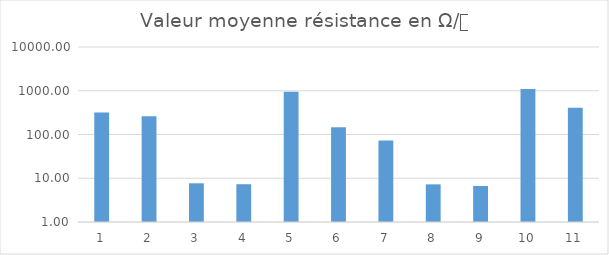
| Category | Series 0 |
|---|---|
| 1.0 | 319.55 |
| 2.0 | 260.09 |
| 3.0 | 7.67 |
| 4.0 | 7.31 |
| 5.0 | 950 |
| 6.0 | 145.87 |
| 7.0 | 72.75 |
| 8.0 | 7.25 |
| 9.0 | 6.65 |
| 10.0 | 1090 |
| 11.0 | 409 |